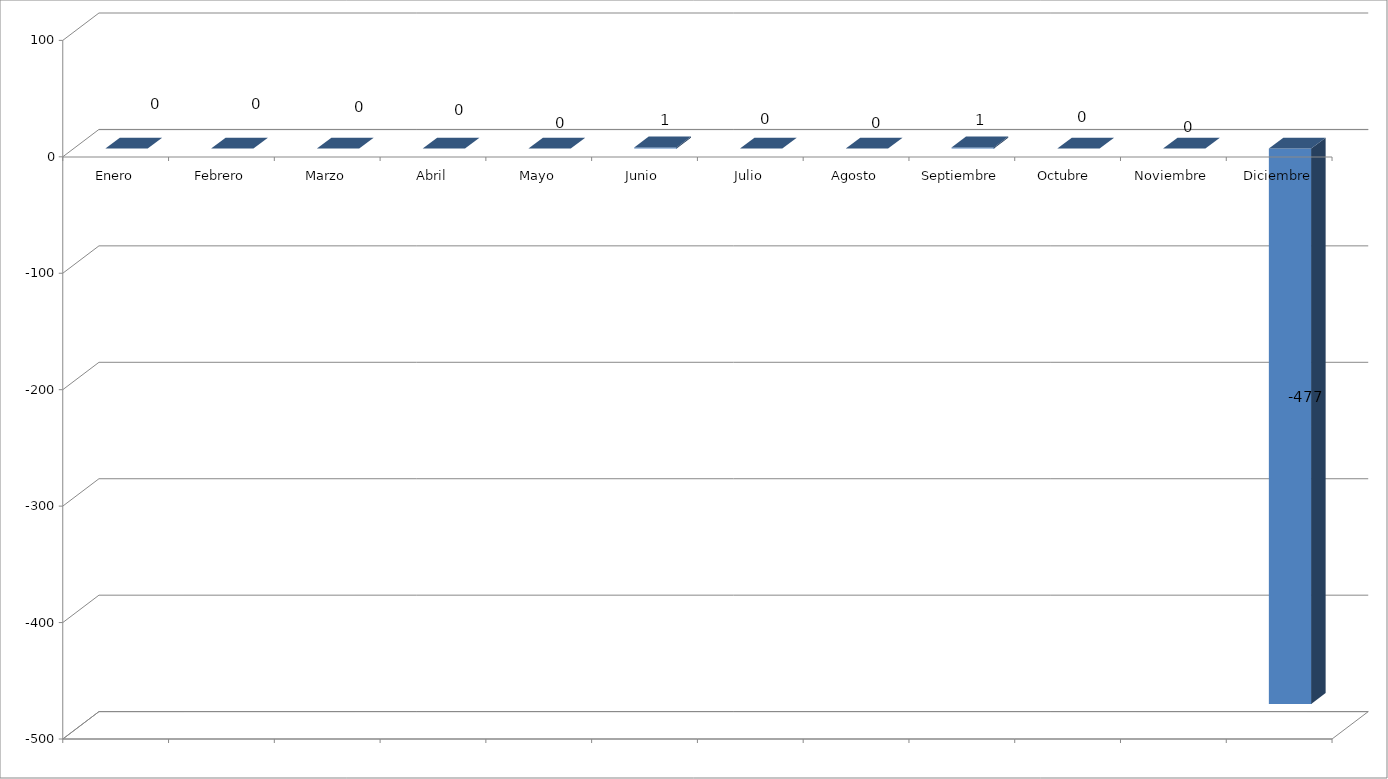
| Category | Series 0 |
|---|---|
| Enero | 0 |
| Febrero | 0 |
| Marzo | 0 |
| Abril | 0 |
| Mayo | 0 |
| Junio  | 1 |
| Julio | 0 |
| Agosto | 0 |
| Septiembre | 1 |
| Octubre  | 0 |
| Noviembre | 0 |
| Diciembre | -477 |